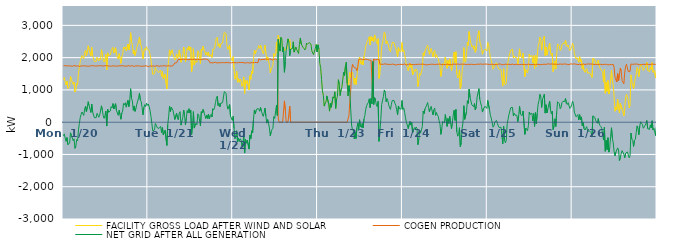
| Category | FACILITY GROSS LOAD AFTER WIND AND SOLAR | COGEN PRODUCTION | NET GRID AFTER ALL GENERATION |
|---|---|---|---|
|  Mon  1/20 | 1325 | 1749 | -424 |
|  Mon  1/20 | 1383 | 1745 | -362 |
|  Mon  1/20 | 1256 | 1751 | -495 |
|  Mon  1/20 | 1149 | 1741 | -592 |
|  Mon  1/20 | 1266 | 1744 | -478 |
|  Mon  1/20 | 1045 | 1740 | -695 |
|  Mon  1/20 | 1041 | 1744 | -703 |
|  Mon  1/20 | 1101 | 1752 | -651 |
|  Mon  1/20 | 1414 | 1745 | -331 |
|  Mon  1/20 | 1321 | 1741 | -420 |
|  Mon  1/20 | 1239 | 1730 | -491 |
|  Mon  1/20 | 1171 | 1744 | -573 |
|  Mon  1/20 | 1242 | 1757 | -515 |
|  Mon  1/20 | 933 | 1744 | -811 |
|  Mon  1/20 | 989 | 1739 | -750 |
|  Mon  1/20 | 1202 | 1740 | -538 |
|  Mon  1/20 | 1163 | 1742 | -579 |
|  Mon  1/20 | 1510 | 1745 | -235 |
|  Mon  1/20 | 1686 | 1731 | -45 |
|  Mon  1/20 | 1878 | 1731 | 147 |
|  Mon  1/20 | 1983 | 1742 | 241 |
|  Mon  1/20 | 2064 | 1749 | 315 |
|  Mon  1/20 | 2003 | 1745 | 258 |
|  Mon  1/20 | 1961 | 1751 | 210 |
|  Mon  1/20 | 2156 | 1745 | 411 |
|  Mon  1/20 | 2227 | 1736 | 491 |
|  Mon  1/20 | 2060 | 1738 | 322 |
|  Mon  1/20 | 2203 | 1733 | 470 |
|  Mon  1/20 | 2369 | 1734 | 635 |
|  Mon  1/20 | 2255 | 1740 | 515 |
|  Mon  1/20 | 2238 | 1736 | 502 |
|  Mon  1/20 | 2047 | 1745 | 302 |
|  Mon  1/20 | 2317 | 1757 | 560 |
|  Mon  1/20 | 2069 | 1751 | 318 |
|  Mon  1/20 | 2088 | 1743 | 345 |
|  Mon  1/20 | 1883 | 1743 | 140 |
|  Mon  1/20 | 1898 | 1741 | 157 |
|  Mon  1/20 | 1878 | 1739 | 139 |
|  Mon  1/20 | 2016 | 1743 | 273 |
|  Mon  1/20 | 1955 | 1735 | 220 |
|  Mon  1/20 | 1901 | 1747 | 154 |
|  Mon  1/20 | 1981 | 1766 | 215 |
|  Mon  1/20 | 1938 | 1752 | 186 |
|  Mon  1/20 | 2245 | 1738 | 507 |
|  Mon  1/20 | 2103 | 1738 | 365 |
|  Mon  1/20 | 1923 | 1724 | 199 |
|  Mon  1/20 | 1862 | 1744 | 118 |
|  Mon  1/20 | 1947 | 1734 | 213 |
|  Mon  1/20 | 2098 | 1753 | 345 |
|  Mon  1/20 | 1622 | 1742 | -120 |
|  Mon  1/20 | 2148 | 1744 | 404 |
|  Mon  1/20 | 2057 | 1750 | 307 |
|  Mon  1/20 | 2027 | 1741 | 286 |
|  Mon  1/20 | 2083 | 1737 | 346 |
|  Mon  1/20 | 2217 | 1734 | 483 |
|  Mon  1/20 | 2190 | 1750 | 440 |
|  Mon  1/20 | 2322 | 1745 | 577 |
|  Mon  1/20 | 2141 | 1733 | 408 |
|  Mon  1/20 | 2126 | 1742 | 384 |
|  Mon  1/20 | 2305 | 1733 | 572 |
|  Mon  1/20 | 2093 | 1736 | 357 |
|  Mon  1/20 | 2082 | 1748 | 334 |
|  Mon  1/20 | 1953 | 1741 | 212 |
|  Mon  1/20 | 2122 | 1749 | 373 |
|  Mon  1/20 | 1983 | 1750 | 233 |
|  Mon  1/20 | 1823 | 1733 | 90 |
|  Mon  1/20 | 2024 | 1746 | 278 |
|  Mon  1/20 | 2102 | 1756 | 346 |
|  Mon  1/20 | 2327 | 1747 | 580 |
|  Mon  1/20 | 2268 | 1736 | 532 |
|  Mon  1/20 | 2336 | 1732 | 604 |
|  Mon  1/20 | 2202 | 1737 | 465 |
|  Mon  1/20 | 2203 | 1742 | 461 |
|  Mon  1/20 | 2423 | 1748 | 675 |
|  Mon  1/20 | 2234 | 1751 | 483 |
|  Mon  1/20 | 2405 | 1737 | 668 |
|  Mon  1/20 | 2772 | 1736 | 1036 |
|  Mon  1/20 | 2485 | 1750 | 735 |
|  Mon  1/20 | 2409 | 1753 | 656 |
|  Mon  1/20 | 2118 | 1750 | 368 |
|  Mon  1/20 | 2228 | 1724 | 504 |
|  Mon  1/20 | 2067 | 1732 | 335 |
|  Mon  1/20 | 2181 | 1750 | 431 |
|  Mon  1/20 | 2317 | 1758 | 559 |
|  Mon  1/20 | 2394 | 1740 | 654 |
|  Mon  1/20 | 2500 | 1743 | 757 |
|  Mon  1/20 | 2640 | 1745 | 895 |
|  Mon  1/20 | 2425 | 1744 | 681 |
|  Mon  1/20 | 2362 | 1727 | 635 |
|  Mon  1/20 | 2195 | 1745 | 450 |
|  Mon  1/20 | 1964 | 1739 | 225 |
|  Mon  1/20 | 2195 | 1735 | 460 |
|  Mon  1/20 | 2284 | 1741 | 543 |
|  Mon  1/20 | 2228 | 1747 | 481 |
|  Mon  1/20 | 2336 | 1746 | 590 |
|  Mon  1/20 | 2269 | 1748 | 521 |
|  Tue  1/21 | 2283 | 1721 | 562 |
|  Tue  1/21 | 2214 | 1732 | 482 |
|  Tue  1/21 | 2097 | 1744 | 353 |
|  Tue  1/21 | 1931 | 1752 | 179 |
|  Tue  1/21 | 1699 | 1734 | -35 |
|  Tue  1/21 | 1481 | 1748 | -267 |
|  Tue  1/21 | 1485 | 1742 | -257 |
|  Tue  1/21 | 1505 | 1743 | -238 |
|  Tue  1/21 | 1694 | 1734 | -40 |
|  Tue  1/21 | 1638 | 1733 | -95 |
|  Tue  1/21 | 1589 | 1754 | -165 |
|  Tue  1/21 | 1576 | 1750 | -174 |
|  Tue  1/21 | 1536 | 1731 | -195 |
|  Tue  1/21 | 1554 | 1748 | -194 |
|  Tue  1/21 | 1614 | 1745 | -131 |
|  Tue  1/21 | 1425 | 1746 | -321 |
|  Tue  1/21 | 1570 | 1738 | -168 |
|  Tue  1/21 | 1341 | 1739 | -398 |
|  Tue  1/21 | 1346 | 1755 | -409 |
|  Tue  1/21 | 1481 | 1735 | -254 |
|  Tue  1/21 | 1477 | 1737 | -260 |
|  Tue  1/21 | 1032 | 1751 | -719 |
|  Tue  1/21 | 1673 | 1747 | -74 |
|  Tue  1/21 | 1903 | 1739 | 164 |
|  Tue  1/21 | 2241 | 1745 | 496 |
|  Tue  1/21 | 2072 | 1748 | 324 |
|  Tue  1/21 | 2204 | 1738 | 466 |
|  Tue  1/21 | 2245 | 1750 | 495 |
|  Tue  1/21 | 2111 | 1752 | 359 |
|  Tue  1/21 | 2113 | 1742 | 371 |
|  Tue  1/21 | 1921 | 1837 | 84 |
|  Tue  1/21 | 1953 | 1839 | 114 |
|  Tue  1/21 | 2115 | 1841 | 274 |
|  Tue  1/21 | 1980 | 1848 | 132 |
|  Tue  1/21 | 2027 | 1955 | 72 |
|  Tue  1/21 | 2240 | 1952 | 288 |
|  Tue  1/21 | 2261 | 1935 | 326 |
|  Tue  1/21 | 1858 | 1950 | -92 |
|  Tue  1/21 | 1978 | 1950 | 28 |
|  Tue  1/21 | 2084 | 1945 | 139 |
|  Tue  1/21 | 2325 | 1948 | 377 |
|  Tue  1/21 | 2163 | 1945 | 218 |
|  Tue  1/21 | 1863 | 1949 | -86 |
|  Tue  1/21 | 2068 | 1945 | 123 |
|  Tue  1/21 | 2305 | 1946 | 359 |
|  Tue  1/21 | 2241 | 1958 | 283 |
|  Tue  1/21 | 2354 | 1935 | 419 |
|  Tue  1/21 | 2220 | 1934 | 286 |
|  Tue  1/21 | 2329 | 1951 | 378 |
|  Tue  1/21 | 1561 | 1939 | -378 |
|  Tue  1/21 | 1827 | 1941 | -114 |
|  Tue  1/21 | 2277 | 1948 | 329 |
|  Tue  1/21 | 1769 | 1953 | -184 |
|  Tue  1/21 | 1863 | 1955 | -92 |
|  Tue  1/21 | 1899 | 1932 | -33 |
|  Tue  1/21 | 1854 | 1938 | -84 |
|  Tue  1/21 | 2212 | 1954 | 258 |
|  Tue  1/21 | 2181 | 1957 | 224 |
|  Tue  1/21 | 2171 | 1939 | 232 |
|  Tue  1/21 | 1813 | 1932 | -119 |
|  Tue  1/21 | 2265 | 1937 | 328 |
|  Tue  1/21 | 2226 | 1939 | 287 |
|  Tue  1/21 | 2354 | 1954 | 400 |
|  Tue  1/21 | 2247 | 1948 | 299 |
|  Tue  1/21 | 2174 | 1958 | 216 |
|  Tue  1/21 | 2077 | 1962 | 115 |
|  Tue  1/21 | 2169 | 1950 | 219 |
|  Tue  1/21 | 2064 | 1946 | 118 |
|  Tue  1/21 | 2175 | 1929 | 246 |
|  Tue  1/21 | 2038 | 1937 | 101 |
|  Tue  1/21 | 2043 | 1839 | 204 |
|  Tue  1/21 | 2088 | 1848 | 240 |
|  Tue  1/21 | 2003 | 1840 | 163 |
|  Tue  1/21 | 2254 | 1838 | 416 |
|  Tue  1/21 | 2226 | 1843 | 383 |
|  Tue  1/21 | 2276 | 1829 | 447 |
|  Tue  1/21 | 2465 | 1857 | 608 |
|  Tue  1/21 | 2599 | 1860 | 739 |
|  Tue  1/21 | 2634 | 1832 | 802 |
|  Tue  1/21 | 2355 | 1839 | 516 |
|  Tue  1/21 | 2433 | 1846 | 587 |
|  Tue  1/21 | 2309 | 1835 | 474 |
|  Tue  1/21 | 2424 | 1837 | 587 |
|  Tue  1/21 | 2417 | 1828 | 589 |
|  Tue  1/21 | 2454 | 1849 | 605 |
|  Tue  1/21 | 2476 | 1847 | 629 |
|  Tue  1/21 | 2789 | 1842 | 947 |
|  Tue  1/21 | 2766 | 1833 | 933 |
|  Tue  1/21 | 2740 | 1846 | 894 |
|  Tue  1/21 | 2373 | 1838 | 535 |
|  Tue  1/21 | 2253 | 1850 | 403 |
|  Tue  1/21 | 2238 | 1848 | 390 |
|  Tue  1/21 | 2383 | 1837 | 546 |
|  Tue  1/21 | 2026 | 1833 | 193 |
|  Tue  1/21 | 2026 | 1841 | 185 |
|  Tue  1/21 | 1894 | 1844 | 50 |
|  Wed  1/22 | 2031 | 1848 | 183 |
|  Wed  1/22 | 1639 | 1837 | -198 |
|  Wed  1/22 | 1332 | 1843 | -511 |
|  Wed  1/22 | 1429 | 1842 | -413 |
|  Wed  1/22 | 1576 | 1840 | -264 |
|  Wed  1/22 | 1239 | 1849 | -610 |
|  Wed  1/22 | 1348 | 1847 | -499 |
|  Wed  1/22 | 1238 | 1832 | -594 |
|  Wed  1/22 | 1334 | 1847 | -513 |
|  Wed  1/22 | 1274 | 1837 | -563 |
|  Wed  1/22 | 1111 | 1849 | -738 |
|  Wed  1/22 | 1196 | 1835 | -639 |
|  Wed  1/22 | 1403 | 1841 | -438 |
|  Wed  1/22 | 893 | 1849 | -956 |
|  Wed  1/22 | 1298 | 1835 | -537 |
|  Wed  1/22 | 1205 | 1855 | -650 |
|  Wed  1/22 | 1289 | 1846 | -557 |
|  Wed  1/22 | 1308 | 1841 | -533 |
|  Wed  1/22 | 1002 | 1835 | -833 |
|  Wed  1/22 | 1440 | 1838 | -398 |
|  Wed  1/22 | 1330 | 1840 | -510 |
|  Wed  1/22 | 1572 | 1839 | -267 |
|  Wed  1/22 | 1508 | 1844 | -336 |
|  Wed  1/22 | 1933 | 1847 | 86 |
|  Wed  1/22 | 2227 | 1847 | 380 |
|  Wed  1/22 | 2117 | 1858 | 259 |
|  Wed  1/22 | 2214 | 1850 | 364 |
|  Wed  1/22 | 2250 | 1835 | 415 |
|  Wed  1/22 | 2284 | 1839 | 445 |
|  Wed  1/22 | 2376 | 1962 | 414 |
|  Wed  1/22 | 2287 | 1949 | 338 |
|  Wed  1/22 | 2388 | 1934 | 454 |
|  Wed  1/22 | 2284 | 1950 | 334 |
|  Wed  1/22 | 2294 | 1948 | 346 |
|  Wed  1/22 | 2119 | 1940 | 179 |
|  Wed  1/22 | 2223 | 1945 | 278 |
|  Wed  1/22 | 2386 | 1950 | 436 |
|  Wed  1/22 | 2154 | 1961 | 193 |
|  Wed  1/22 | 1913 | 1944 | -31 |
|  Wed  1/22 | 2023 | 1941 | 82 |
|  Wed  1/22 | 1911 | 1941 | -30 |
|  Wed  1/22 | 1781 | 1961 | -180 |
|  Wed  1/22 | 1529 | 1954 | -425 |
|  Wed  1/22 | 1658 | 1954 | -296 |
|  Wed  1/22 | 1695 | 1920 | -225 |
|  Wed  1/22 | 1763 | 1947 | -184 |
|  Wed  1/22 | 2125 | 1951 | 174 |
|  Wed  1/22 | 2040 | 1923 | 117 |
|  Wed  1/22 | 2074 | 1954 | 120 |
|  Wed  1/22 | 2486 | 1960 | 526 |
|  Wed  1/22 | 2133 | 1924 | 209 |
|  Wed  1/22 | 2690 | 127 | 2563 |
|  Wed  1/22 | 2592 | 0 | 2592 |
|  Wed  1/22 | 2203 | 0 | 2203 |
|  Wed  1/22 | 2629 | 0 | 2629 |
|  Wed  1/22 | 2587 | 0 | 2587 |
|  Wed  1/22 | 2178 | 0 | 2178 |
|  Wed  1/22 | 2330 | 0 | 2330 |
|  Wed  1/22 | 2206 | 659 | 1547 |
|  Wed  1/22 | 2241 | 372 | 1869 |
|  Wed  1/22 | 2234 | 0 | 2234 |
|  Wed  1/22 | 2259 | 0 | 2259 |
|  Wed  1/22 | 2582 | 0 | 2582 |
|  Wed  1/22 | 2493 | 0 | 2493 |
|  Wed  1/22 | 2557 | 496 | 2061 |
|  Wed  1/22 | 2265 | 0 | 2265 |
|  Wed  1/22 | 2275 | 0 | 2275 |
|  Wed  1/22 | 2279 | 0 | 2279 |
|  Wed  1/22 | 2489 | 0 | 2489 |
|  Wed  1/22 | 2171 | 0 | 2171 |
|  Wed  1/22 | 2252 | 0 | 2252 |
|  Wed  1/22 | 2329 | 0 | 2329 |
|  Wed  1/22 | 2244 | 0 | 2244 |
|  Wed  1/22 | 2268 | 0 | 2268 |
|  Wed  1/22 | 2129 | 0 | 2129 |
|  Wed  1/22 | 2413 | 0 | 2413 |
|  Wed  1/22 | 2609 | 0 | 2609 |
|  Wed  1/22 | 2423 | 0 | 2423 |
|  Wed  1/22 | 2374 | 0 | 2374 |
|  Wed  1/22 | 2321 | 0 | 2321 |
|  Wed  1/22 | 2290 | 0 | 2290 |
|  Wed  1/22 | 2238 | 0 | 2238 |
|  Wed  1/22 | 2270 | 0 | 2270 |
|  Wed  1/22 | 2449 | 0 | 2449 |
|  Wed  1/22 | 2413 | 0 | 2413 |
|  Wed  1/22 | 2420 | 0 | 2420 |
|  Wed  1/22 | 2470 | 0 | 2470 |
|  Wed  1/22 | 2460 | 0 | 2460 |
|  Wed  1/22 | 2417 | 0 | 2417 |
|  Wed  1/22 | 2210 | 0 | 2210 |
|  Wed  1/22 | 2144 | 0 | 2144 |
|  Wed  1/22 | 2095 | 0 | 2095 |
|  Wed  1/22 | 2204 | 0 | 2204 |
|  Wed  1/22 | 2290 | 0 | 2290 |
|  Wed  1/22 | 2403 | 0 | 2403 |
|  Wed  1/22 | 2175 | 0 | 2175 |
|  Thu  1/23 | 2397 | 0 | 2397 |
|  Thu  1/23 | 2264 | 0 | 2264 |
|  Thu  1/23 | 1825 | 0 | 1825 |
|  Thu  1/23 | 1689 | 0 | 1689 |
|  Thu  1/23 | 1322 | 0 | 1322 |
|  Thu  1/23 | 974 | 0 | 974 |
|  Thu  1/23 | 835 | 0 | 835 |
|  Thu  1/23 | 498 | 0 | 498 |
|  Thu  1/23 | 589 | 0 | 589 |
|  Thu  1/23 | 624 | 0 | 624 |
|  Thu  1/23 | 815 | 0 | 815 |
|  Thu  1/23 | 795 | 0 | 795 |
|  Thu  1/23 | 572 | 0 | 572 |
|  Thu  1/23 | 342 | 0 | 342 |
|  Thu  1/23 | 579 | 0 | 579 |
|  Thu  1/23 | 461 | 0 | 461 |
|  Thu  1/23 | 474 | 0 | 474 |
|  Thu  1/23 | 785 | 0 | 785 |
|  Thu  1/23 | 748 | 0 | 748 |
|  Thu  1/23 | 942 | 0 | 942 |
|  Thu  1/23 | 426 | 0 | 426 |
|  Thu  1/23 | 719 | 0 | 719 |
|  Thu  1/23 | 801 | 0 | 801 |
|  Thu  1/23 | 1316 | 0 | 1316 |
|  Thu  1/23 | 1186 | 0 | 1186 |
|  Thu  1/23 | 824 | 0 | 824 |
|  Thu  1/23 | 999 | 0 | 999 |
|  Thu  1/23 | 1080 | 0 | 1080 |
|  Thu  1/23 | 1073 | 0 | 1073 |
|  Thu  1/23 | 1546 | 0 | 1546 |
|  Thu  1/23 | 1449 | 0 | 1449 |
|  Thu  1/23 | 1729 | 0 | 1729 |
|  Thu  1/23 | 1858 | 0 | 1858 |
|  Thu  1/23 | 1196 | 0 | 1196 |
|  Thu  1/23 | 811 | 0 | 811 |
|  Thu  1/23 | 1339 | 202 | 1137 |
|  Thu  1/23 | 1544 | 619 | 925 |
|  Thu  1/23 | 1385 | 998 | 387 |
|  Thu  1/23 | 1510 | 1599 | -89 |
|  Thu  1/23 | 1546 | 1795 | -249 |
|  Thu  1/23 | 1573 | 1787 | -214 |
|  Thu  1/23 | 1174 | 1694 | -520 |
|  Thu  1/23 | 1369 | 1683 | -314 |
|  Thu  1/23 | 1167 | 1676 | -509 |
|  Thu  1/23 | 1420 | 1593 | -173 |
|  Thu  1/23 | 1681 | 1707 | -26 |
|  Thu  1/23 | 1706 | 1937 | -231 |
|  Thu  1/23 | 2019 | 1945 | 74 |
|  Thu  1/23 | 1829 | 1960 | -131 |
|  Thu  1/23 | 1792 | 1954 | -162 |
|  Thu  1/23 | 1909 | 1947 | -38 |
|  Thu  1/23 | 1777 | 1954 | -177 |
|  Thu  1/23 | 2032 | 1933 | 99 |
|  Thu  1/23 | 2153 | 1944 | 209 |
|  Thu  1/23 | 2357 | 1956 | 401 |
|  Thu  1/23 | 2453 | 1940 | 513 |
|  Thu  1/23 | 2483 | 1942 | 541 |
|  Thu  1/23 | 2576 | 1958 | 618 |
|  Thu  1/23 | 2647 | 1924 | 723 |
|  Thu  1/23 | 2390 | 1940 | 450 |
|  Thu  1/23 | 2651 | 1917 | 734 |
|  Thu  1/23 | 2517 | 1943 | 574 |
|  Thu  1/23 | 2619 | 741 | 1878 |
|  Thu  1/23 | 2501 | 1955 | 546 |
|  Thu  1/23 | 2704 | 1944 | 760 |
|  Thu  1/23 | 2621 | 1934 | 687 |
|  Thu  1/23 | 2476 | 1946 | 530 |
|  Thu  1/23 | 2421 | 1940 | 481 |
|  Thu  1/23 | 2590 | 1942 | 648 |
|  Thu  1/23 | 1355 | 1948 | -593 |
|  Thu  1/23 | 1492 | 1796 | -304 |
|  Thu  1/23 | 1880 | 1801 | 79 |
|  Thu  1/23 | 2340 | 1793 | 547 |
|  Thu  1/23 | 2359 | 1799 | 560 |
|  Thu  1/23 | 2593 | 1795 | 798 |
|  Thu  1/23 | 2795 | 1797 | 998 |
|  Thu  1/23 | 2737 | 1809 | 928 |
|  Thu  1/23 | 2430 | 1796 | 634 |
|  Thu  1/23 | 2521 | 1793 | 728 |
|  Thu  1/23 | 2454 | 1793 | 661 |
|  Thu  1/23 | 2327 | 1793 | 534 |
|  Thu  1/23 | 2226 | 1781 | 445 |
|  Thu  1/23 | 2181 | 1785 | 396 |
|  Thu  1/23 | 2340 | 1786 | 554 |
|  Thu  1/23 | 2473 | 1800 | 673 |
|  Thu  1/23 | 2463 | 1784 | 679 |
|  Thu  1/23 | 2463 | 1791 | 672 |
|  Thu  1/23 | 2360 | 1775 | 585 |
|  Thu  1/23 | 2291 | 1770 | 521 |
|  Thu  1/23 | 2168 | 1787 | 381 |
|  Thu  1/23 | 2019 | 1788 | 231 |
|  Thu  1/23 | 2311 | 1809 | 502 |
|  Thu  1/23 | 2209 | 1790 | 419 |
|  Thu  1/23 | 2217 | 1792 | 425 |
|  Thu  1/23 | 2193 | 1792 | 401 |
|  Thu  1/23 | 2468 | 1796 | 672 |
|  Fri  1/24 | 2185 | 1787 | 398 |
|  Fri  1/24 | 2241 | 1800 | 441 |
|  Fri  1/24 | 2105 | 1803 | 302 |
|  Fri  1/24 | 1935 | 1801 | 134 |
|  Fri  1/24 | 1765 | 1770 | -5 |
|  Fri  1/24 | 1696 | 1783 | -87 |
|  Fri  1/24 | 1592 | 1791 | -199 |
|  Fri  1/24 | 1580 | 1801 | -221 |
|  Fri  1/24 | 1820 | 1799 | 21 |
|  Fri  1/24 | 1697 | 1786 | -89 |
|  Fri  1/24 | 1779 | 1784 | -5 |
|  Fri  1/24 | 1462 | 1789 | -327 |
|  Fri  1/24 | 1523 | 1782 | -259 |
|  Fri  1/24 | 1629 | 1797 | -168 |
|  Fri  1/24 | 1576 | 1789 | -213 |
|  Fri  1/24 | 1652 | 1802 | -150 |
|  Fri  1/24 | 1597 | 1791 | -194 |
|  Fri  1/24 | 1105 | 1803 | -698 |
|  Fri  1/24 | 1267 | 1796 | -529 |
|  Fri  1/24 | 1515 | 1790 | -275 |
|  Fri  1/24 | 1454 | 1793 | -339 |
|  Fri  1/24 | 1556 | 1793 | -237 |
|  Fri  1/24 | 1662 | 1800 | -138 |
|  Fri  1/24 | 2148 | 1802 | 346 |
|  Fri  1/24 | 2059 | 1792 | 267 |
|  Fri  1/24 | 2202 | 1790 | 412 |
|  Fri  1/24 | 2203 | 1774 | 429 |
|  Fri  1/24 | 2325 | 1794 | 531 |
|  Fri  1/24 | 2392 | 1784 | 608 |
|  Fri  1/24 | 2247 | 1786 | 461 |
|  Fri  1/24 | 2103 | 1786 | 317 |
|  Fri  1/24 | 2223 | 1796 | 427 |
|  Fri  1/24 | 2288 | 1797 | 491 |
|  Fri  1/24 | 2261 | 1785 | 476 |
|  Fri  1/24 | 2022 | 1796 | 226 |
|  Fri  1/24 | 2173 | 1797 | 376 |
|  Fri  1/24 | 2224 | 1787 | 437 |
|  Fri  1/24 | 2003 | 1791 | 212 |
|  Fri  1/24 | 2090 | 1794 | 296 |
|  Fri  1/24 | 2010 | 1784 | 226 |
|  Fri  1/24 | 1975 | 1794 | 181 |
|  Fri  1/24 | 1830 | 1787 | 43 |
|  Fri  1/24 | 1740 | 1803 | -63 |
|  Fri  1/24 | 1419 | 1797 | -378 |
|  Fri  1/24 | 1579 | 1783 | -204 |
|  Fri  1/24 | 1821 | 1794 | 27 |
|  Fri  1/24 | 1826 | 1791 | 35 |
|  Fri  1/24 | 1762 | 1790 | -28 |
|  Fri  1/24 | 2016 | 1779 | 237 |
|  Fri  1/24 | 2003 | 1794 | 209 |
|  Fri  1/24 | 1671 | 1801 | -130 |
|  Fri  1/24 | 1916 | 1800 | 116 |
|  Fri  1/24 | 1742 | 1785 | -43 |
|  Fri  1/24 | 1965 | 1785 | 180 |
|  Fri  1/24 | 1764 | 1780 | -16 |
|  Fri  1/24 | 1592 | 1799 | -207 |
|  Fri  1/24 | 1779 | 1790 | -11 |
|  Fri  1/24 | 2029 | 1808 | 221 |
|  Fri  1/24 | 2172 | 1802 | 370 |
|  Fri  1/24 | 1840 | 1784 | 56 |
|  Fri  1/24 | 2185 | 1791 | 394 |
|  Fri  1/24 | 1492 | 1794 | -302 |
|  Fri  1/24 | 1369 | 1803 | -434 |
|  Fri  1/24 | 1415 | 1800 | -385 |
|  Fri  1/24 | 1620 | 1791 | -171 |
|  Fri  1/24 | 1039 | 1794 | -755 |
|  Fri  1/24 | 1154 | 1800 | -646 |
|  Fri  1/24 | 1578 | 1773 | -195 |
|  Fri  1/24 | 1780 | 1796 | -16 |
|  Fri  1/24 | 2310 | 1799 | 511 |
|  Fri  1/24 | 1883 | 1796 | 87 |
|  Fri  1/24 | 1852 | 1783 | 69 |
|  Fri  1/24 | 2105 | 1783 | 322 |
|  Fri  1/24 | 2471 | 1806 | 665 |
|  Fri  1/24 | 2378 | 1795 | 583 |
|  Fri  1/24 | 2806 | 1785 | 1021 |
|  Fri  1/24 | 2556 | 1788 | 768 |
|  Fri  1/24 | 2577 | 1791 | 786 |
|  Fri  1/24 | 2333 | 1796 | 537 |
|  Fri  1/24 | 2370 | 1803 | 567 |
|  Fri  1/24 | 2264 | 1784 | 480 |
|  Fri  1/24 | 2364 | 1786 | 578 |
|  Fri  1/24 | 2165 | 1787 | 378 |
|  Fri  1/24 | 2272 | 1795 | 477 |
|  Fri  1/24 | 2578 | 1798 | 780 |
|  Fri  1/24 | 2573 | 1793 | 780 |
|  Fri  1/24 | 2832 | 1795 | 1037 |
|  Fri  1/24 | 2502 | 1792 | 710 |
|  Fri  1/24 | 2400 | 1804 | 596 |
|  Fri  1/24 | 2279 | 1791 | 488 |
|  Fri  1/24 | 2106 | 1792 | 314 |
|  Fri  1/24 | 2203 | 1796 | 407 |
|  Fri  1/24 | 2186 | 1800 | 386 |
|  Fri  1/24 | 2265 | 1772 | 493 |
|  Fri  1/24 | 2293 | 1801 | 492 |
|  Fri  1/24 | 2207 | 1782 | 425 |
|  Sat  1/25 | 2471 | 1796 | 675 |
|  Sat  1/25 | 2429 | 1783 | 646 |
|  Sat  1/25 | 2183 | 1788 | 395 |
|  Sat  1/25 | 2006 | 1792 | 214 |
|  Sat  1/25 | 1914 | 1794 | 120 |
|  Sat  1/25 | 1782 | 1784 | -2 |
|  Sat  1/25 | 1641 | 1796 | -155 |
|  Sat  1/25 | 1682 | 1803 | -121 |
|  Sat  1/25 | 1790 | 1780 | 10 |
|  Sat  1/25 | 1790 | 1779 | 11 |
|  Sat  1/25 | 1837 | 1785 | 52 |
|  Sat  1/25 | 1749 | 1791 | -42 |
|  Sat  1/25 | 1680 | 1799 | -119 |
|  Sat  1/25 | 1631 | 1798 | -167 |
|  Sat  1/25 | 1659 | 1805 | -146 |
|  Sat  1/25 | 1624 | 1780 | -156 |
|  Sat  1/25 | 1642 | 1778 | -136 |
|  Sat  1/25 | 1116 | 1789 | -673 |
|  Sat  1/25 | 1655 | 1783 | -128 |
|  Sat  1/25 | 1208 | 1770 | -562 |
|  Sat  1/25 | 1159 | 1799 | -640 |
|  Sat  1/25 | 1224 | 1776 | -552 |
|  Sat  1/25 | 1739 | 1790 | -51 |
|  Sat  1/25 | 1879 | 1794 | 85 |
|  Sat  1/25 | 2032 | 1795 | 237 |
|  Sat  1/25 | 2025 | 1773 | 252 |
|  Sat  1/25 | 2230 | 1784 | 446 |
|  Sat  1/25 | 2246 | 1780 | 466 |
|  Sat  1/25 | 2258 | 1800 | 458 |
|  Sat  1/25 | 1987 | 1790 | 197 |
|  Sat  1/25 | 2052 | 1779 | 273 |
|  Sat  1/25 | 2011 | 1794 | 217 |
|  Sat  1/25 | 2024 | 1796 | 228 |
|  Sat  1/25 | 1993 | 1781 | 212 |
|  Sat  1/25 | 1801 | 1788 | 13 |
|  Sat  1/25 | 1995 | 1797 | 198 |
|  Sat  1/25 | 2274 | 1783 | 491 |
|  Sat  1/25 | 2047 | 1801 | 246 |
|  Sat  1/25 | 2059 | 1791 | 268 |
|  Sat  1/25 | 1985 | 1782 | 203 |
|  Sat  1/25 | 2136 | 1790 | 346 |
|  Sat  1/25 | 2116 | 1770 | 346 |
|  Sat  1/25 | 1413 | 1790 | -377 |
|  Sat  1/25 | 1628 | 1810 | -182 |
|  Sat  1/25 | 1605 | 1779 | -174 |
|  Sat  1/25 | 1524 | 1789 | -265 |
|  Sat  1/25 | 1692 | 1802 | -110 |
|  Sat  1/25 | 2110 | 1797 | 313 |
|  Sat  1/25 | 2025 | 1782 | 243 |
|  Sat  1/25 | 2013 | 1791 | 222 |
|  Sat  1/25 | 2065 | 1786 | 279 |
|  Sat  1/25 | 1842 | 1799 | 43 |
|  Sat  1/25 | 2059 | 1793 | 266 |
|  Sat  1/25 | 1664 | 1793 | -129 |
|  Sat  1/25 | 2074 | 1776 | 298 |
|  Sat  1/25 | 1729 | 1781 | -52 |
|  Sat  1/25 | 2073 | 1799 | 274 |
|  Sat  1/25 | 2350 | 1794 | 556 |
|  Sat  1/25 | 2456 | 1786 | 670 |
|  Sat  1/25 | 2638 | 1778 | 860 |
|  Sat  1/25 | 2571 | 1783 | 788 |
|  Sat  1/25 | 2231 | 1776 | 455 |
|  Sat  1/25 | 2500 | 1790 | 710 |
|  Sat  1/25 | 2478 | 1797 | 681 |
|  Sat  1/25 | 2660 | 1795 | 865 |
|  Sat  1/25 | 2058 | 1777 | 281 |
|  Sat  1/25 | 2330 | 1790 | 540 |
|  Sat  1/25 | 2077 | 1792 | 285 |
|  Sat  1/25 | 2216 | 1809 | 407 |
|  Sat  1/25 | 2216 | 1798 | 418 |
|  Sat  1/25 | 2453 | 1798 | 655 |
|  Sat  1/25 | 2168 | 1786 | 382 |
|  Sat  1/25 | 2061 | 1803 | 258 |
|  Sat  1/25 | 2141 | 1799 | 342 |
|  Sat  1/25 | 1569 | 1798 | -229 |
|  Sat  1/25 | 1668 | 1791 | -123 |
|  Sat  1/25 | 1901 | 1798 | 103 |
|  Sat  1/25 | 1653 | 1785 | -132 |
|  Sat  1/25 | 2100 | 1796 | 304 |
|  Sat  1/25 | 2424 | 1791 | 633 |
|  Sat  1/25 | 2437 | 1790 | 647 |
|  Sat  1/25 | 2360 | 1785 | 575 |
|  Sat  1/25 | 2221 | 1805 | 416 |
|  Sat  1/25 | 2252 | 1792 | 460 |
|  Sat  1/25 | 2399 | 1792 | 607 |
|  Sat  1/25 | 2443 | 1798 | 645 |
|  Sat  1/25 | 2433 | 1802 | 631 |
|  Sat  1/25 | 2445 | 1804 | 641 |
|  Sat  1/25 | 2535 | 1803 | 732 |
|  Sat  1/25 | 2371 | 1792 | 579 |
|  Sat  1/25 | 2339 | 1791 | 548 |
|  Sat  1/25 | 2392 | 1788 | 604 |
|  Sat  1/25 | 2289 | 1784 | 505 |
|  Sat  1/25 | 2216 | 1789 | 427 |
|  Sat  1/25 | 2271 | 1808 | 463 |
|  Sat  1/25 | 2339 | 1797 | 542 |
|  Sun  1/26 | 2445 | 1798 | 647 |
|  Sun  1/26 | 2372 | 1797 | 575 |
|  Sun  1/26 | 2118 | 1808 | 310 |
|  Sun  1/26 | 2096 | 1803 | 293 |
|  Sun  1/26 | 1962 | 1795 | 167 |
|  Sun  1/26 | 2003 | 1799 | 204 |
|  Sun  1/26 | 2023 | 1785 | 238 |
|  Sun  1/26 | 1858 | 1786 | 72 |
|  Sun  1/26 | 2028 | 1796 | 232 |
|  Sun  1/26 | 1875 | 1804 | 71 |
|  Sun  1/26 | 1938 | 1775 | 163 |
|  Sun  1/26 | 1662 | 1776 | -114 |
|  Sun  1/26 | 1790 | 1806 | -16 |
|  Sun  1/26 | 1594 | 1796 | -202 |
|  Sun  1/26 | 1545 | 1788 | -243 |
|  Sun  1/26 | 1555 | 1786 | -231 |
|  Sun  1/26 | 1660 | 1798 | -138 |
|  Sun  1/26 | 1519 | 1796 | -277 |
|  Sun  1/26 | 1501 | 1806 | -305 |
|  Sun  1/26 | 1534 | 1802 | -268 |
|  Sun  1/26 | 1541 | 1799 | -258 |
|  Sun  1/26 | 1453 | 1779 | -326 |
|  Sun  1/26 | 1383 | 1804 | -421 |
|  Sun  1/26 | 1976 | 1781 | 195 |
|  Sun  1/26 | 1985 | 1788 | 197 |
|  Sun  1/26 | 1948 | 1795 | 153 |
|  Sun  1/26 | 1956 | 1791 | 165 |
|  Sun  1/26 | 1771 | 1775 | -4 |
|  Sun  1/26 | 1746 | 1781 | -35 |
|  Sun  1/26 | 1920 | 1808 | 112 |
|  Sun  1/26 | 1757 | 1793 | -36 |
|  Sun  1/26 | 1678 | 1779 | -101 |
|  Sun  1/26 | 1658 | 1792 | -134 |
|  Sun  1/26 | 1593 | 1790 | -197 |
|  Sun  1/26 | 1557 | 1782 | -225 |
|  Sun  1/26 | 1241 | 1795 | -554 |
|  Sun  1/26 | 1633 | 1789 | -156 |
|  Sun  1/26 | 894 | 1796 | -902 |
|  Sun  1/26 | 1233 | 1797 | -564 |
|  Sun  1/26 | 954 | 1808 | -854 |
|  Sun  1/26 | 1295 | 1776 | -481 |
|  Sun  1/26 | 872 | 1799 | -927 |
|  Sun  1/26 | 994 | 1786 | -792 |
|  Sun  1/26 | 1341 | 1787 | -446 |
|  Sun  1/26 | 1608 | 1781 | -173 |
|  Sun  1/26 | 1282 | 1779 | -497 |
|  Sun  1/26 | 1149 | 1793 | -644 |
|  Sun  1/26 | 775 | 1692 | -917 |
|  Sun  1/26 | 337 | 1381 | -1044 |
|  Sun  1/26 | 471 | 1396 | -925 |
|  Sun  1/26 | 384 | 1246 | -862 |
|  Sun  1/26 | 709 | 1505 | -796 |
|  Sun  1/26 | 433 | 1292 | -859 |
|  Sun  1/26 | 284 | 1475 | -1191 |
|  Sun  1/26 | 582 | 1678 | -1096 |
|  Sun  1/26 | 608 | 1580 | -972 |
|  Sun  1/26 | 408 | 1290 | -882 |
|  Sun  1/26 | 384 | 1240 | -856 |
|  Sun  1/26 | 195 | 1187 | -992 |
|  Sun  1/26 | 449 | 1552 | -1103 |
|  Sun  1/26 | 770 | 1732 | -962 |
|  Sun  1/26 | 863 | 1795 | -932 |
|  Sun  1/26 | 872 | 1793 | -921 |
|  Sun  1/26 | 666 | 1565 | -899 |
|  Sun  1/26 | 446 | 1551 | -1105 |
|  Sun  1/26 | 531 | 1570 | -1039 |
|  Sun  1/26 | 1465 | 1802 | -337 |
|  Sun  1/26 | 1255 | 1779 | -524 |
|  Sun  1/26 | 1238 | 1794 | -556 |
|  Sun  1/26 | 1040 | 1791 | -751 |
|  Sun  1/26 | 1231 | 1797 | -566 |
|  Sun  1/26 | 1256 | 1786 | -530 |
|  Sun  1/26 | 1483 | 1804 | -321 |
|  Sun  1/26 | 1696 | 1811 | -115 |
|  Sun  1/26 | 1596 | 1794 | -198 |
|  Sun  1/26 | 1410 | 1799 | -389 |
|  Sun  1/26 | 1659 | 1777 | -118 |
|  Sun  1/26 | 1800 | 1788 | 12 |
|  Sun  1/26 | 1806 | 1785 | 21 |
|  Sun  1/26 | 1714 | 1786 | -72 |
|  Sun  1/26 | 1605 | 1792 | -187 |
|  Sun  1/26 | 1648 | 1796 | -148 |
|  Sun  1/26 | 1690 | 1789 | -99 |
|  Sun  1/26 | 1750 | 1788 | -38 |
|  Sun  1/26 | 1857 | 1804 | 53 |
|  Sun  1/26 | 1603 | 1803 | -200 |
|  Sun  1/26 | 1599 | 1784 | -185 |
|  Sun  1/26 | 1565 | 1789 | -224 |
|  Sun  1/26 | 1706 | 1789 | -83 |
|  Sun  1/26 | 1631 | 1805 | -174 |
|  Sun  1/26 | 1844 | 1801 | 43 |
|  Sun  1/26 | 1546 | 1790 | -244 |
|  Sun  1/26 | 1602 | 1794 | -192 |
|  Sun  1/26 | 1589 | 1784 | -195 |
|  Sun  1/26 | 1373 | 1790 | -417 |
|  Sun  1/26 | 1672 | 1785 | -113 |